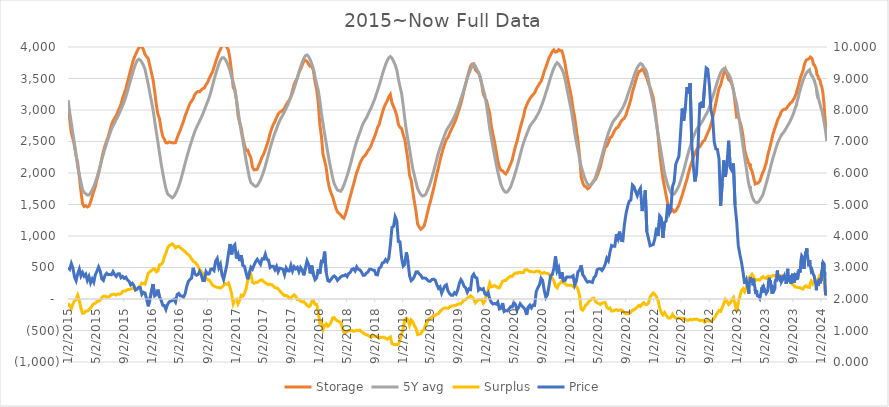
| Category | Storage | 5Y avg | Surplus |
|---|---|---|---|
| 2015-01-02 | 3089 | 3156 | -67 |
| 2015-01-09 | 2854 | 2965 | -111 |
| 2015-01-16 | 2637 | 2791 | -154 |
| 2015-01-23 | 2543 | 2622 | -79 |
| 2015-01-30 | 2428 | 2457 | -29 |
| 2015-02-06 | 2268 | 2279 | -11 |
| 2015-02-13 | 2158 | 2099 | 59 |
| 2015-02-20 | 1938 | 1968 | -30 |
| 2015-02-27 | 1709 | 1853 | -144 |
| 2015-03-06 | 1511 | 1737 | -226 |
| 2015-03-13 | 1468 | 1692 | -224 |
| 2015-03-20 | 1479 | 1672 | -193 |
| 2015-03-27 | 1461 | 1651 | -190 |
| 2015-04-03 | 1476 | 1650 | -174 |
| 2015-04-10 | 1539 | 1684 | -145 |
| 2015-04-17 | 1628 | 1730 | -102 |
| 2015-04-24 | 1711 | 1785 | -74 |
| 2015-05-01 | 1785 | 1853 | -68 |
| 2015-05-08 | 1897 | 1935 | -38 |
| 2015-05-15 | 1989 | 2024 | -35 |
| 2015-05-22 | 2101 | 2118 | -17 |
| 2015-05-29 | 2233 | 2211 | 22 |
| 2015-06-05 | 2344 | 2301 | 43 |
| 2015-06-12 | 2433 | 2387 | 46 |
| 2015-06-19 | 2506 | 2474 | 32 |
| 2015-06-26 | 2579 | 2548 | 31 |
| 2015-07-03 | 2666 | 2623 | 43 |
| 2015-07-10 | 2764 | 2694 | 70 |
| 2015-07-17 | 2823 | 2748 | 75 |
| 2015-07-24 | 2872 | 2796 | 76 |
| 2015-07-31 | 2910 | 2848 | 62 |
| 2015-08-07 | 2975 | 2896 | 79 |
| 2015-08-14 | 3027 | 2950 | 77 |
| 2015-08-21 | 3094 | 3012 | 82 |
| 2015-08-28 | 3190 | 3070 | 120 |
| 2015-09-04 | 3262 | 3133 | 129 |
| 2015-09-11 | 3336 | 3209 | 127 |
| 2015-09-18 | 3441 | 3292 | 149 |
| 2015-09-25 | 3537 | 3385 | 152 |
| 2015-10-02 | 3634 | 3478 | 156 |
| 2015-10-09 | 3731 | 3565 | 166 |
| 2015-10-16 | 3813 | 3651 | 162 |
| 2015-10-23 | 3875 | 3724 | 151 |
| 2015-10-30 | 3931 | 3782 | 149 |
| 2015-11-06 | 3985 | 3805 | 180 |
| 2015-11-13 | 4000 | 3793 | 207 |
| 2015-11-20 | 4009 | 3757 | 252 |
| 2015-11-27 | 3956 | 3709 | 247 |
| 2015-12-04 | 3880 | 3644 | 236 |
| 2015-12-11 | 3846 | 3524 | 322 |
| 2015-12-18 | 3814 | 3403 | 411 |
| 2016-01-08 | 3475 | 3001 | 474 |
| 2016-01-15 | 3297 | 2824 | 473 |
| 2016-01-22 | 3086 | 2654 | 432 |
| 2016-01-29 | 2934 | 2489 | 445 |
| 2016-02-05 | 2864 | 2321 | 543 |
| 2016-02-12 | 2701 | 2151 | 550 |
| 2016-02-19 | 2584 | 2007 | 577 |
| 2016-02-26 | 2536 | 1870 | 666 |
| 2016-03-04 | 2479 | 1752 | 727 |
| 2016-03-11 | 2478 | 1671 | 807 |
| 2016-03-18 | 2493 | 1647 | 846 |
| 2016-04-01 | 2480 | 1606 | 874 |
| 2016-04-08 | 2477 | 1628 | 849 |
| 2016-04-15 | 2484 | 1673 | 811 |
| 2016-04-22 | 2557 | 1725 | 832 |
| 2016-04-29 | 2625 | 1789 | 836 |
| 2016-05-06 | 2681 | 1868 | 813 |
| 2016-05-13 | 2754 | 1959 | 795 |
| 2016-05-20 | 2825 | 2056 | 769 |
| 2016-05-27 | 2907 | 2154 | 753 |
| 2016-06-03 | 2972 | 2250 | 722 |
| 2016-06-10 | 3041 | 2337 | 704 |
| 2016-06-17 | 3103 | 2425 | 678 |
| 2016-06-24 | 3140 | 2503 | 637 |
| 2016-07-01 | 3179 | 2580 | 599 |
| 2016-07-08 | 3243 | 2657 | 586 |
| 2016-07-15 | 3277 | 2718 | 559 |
| 2016-07-22 | 3294 | 2770 | 524 |
| 2016-07-29 | 3288 | 2824 | 464 |
| 2016-08-05 | 3317 | 2877 | 440 |
| 2016-08-12 | 3339 | 2934 | 405 |
| 2016-08-19 | 3350 | 3000 | 350 |
| 2016-08-26 | 3401 | 3067 | 334 |
| 2016-09-02 | 3437 | 3131 | 306 |
| 2016-09-09 | 3499 | 3200 | 299 |
| 2016-09-16 | 3551 | 3283 | 268 |
| 2016-09-23 | 3600 | 3380 | 220 |
| 2016-09-30 | 3680 | 3475 | 205 |
| 2016-10-07 | 3759 | 3567 | 192 |
| 2016-10-14 | 3836 | 3651 | 185 |
| 2016-10-21 | 3909 | 3727 | 182 |
| 2016-10-28 | 3963 | 3790 | 173 |
| 2016-11-04 | 4017 | 3828 | 189 |
| 2016-11-11 | 4047 | 3831 | 216 |
| 2016-11-18 | 4045 | 3804 | 241 |
| 2016-11-25 | 3995 | 3760 | 235 |
| 2016-12-02 | 3953 | 3699 | 254 |
| 2016-12-09 | 3806 | 3620 | 186 |
| 2016-12-16 | 3597 | 3519 | 78 |
| 2016-12-23 | 3360 | 3439 | -79 |
| 2016-12-30 | 3311 | 3332 | -21 |
| 2017-01-06 | 3160 | 3164 | -4 |
| 2017-01-13 | 2917 | 2994 | -77 |
| 2017-01-20 | 2798 | 2818 | -20 |
| 2017-01-27 | 2711 | 2652 | 59 |
| 2017-02-03 | 2559 | 2514 | 45 |
| 2017-02-10 | 2445 | 2358 | 87 |
| 2017-02-17 | 2356 | 2200 | 156 |
| 2017-02-24 | 2363 | 2068 | 295 |
| 2017-03-03 | 2295 | 1932 | 363 |
| 2017-03-10 | 2242 | 1847 | 395 |
| 2017-03-17 | 2092 | 1826 | 266 |
| 2017-03-24 | 2049 | 1799 | 250 |
| 2017-03-31 | 2051 | 1786 | 265 |
| 2017-04-07 | 2061 | 1798 | 263 |
| 2017-04-21 | 2189 | 1890 | 299 |
| 2017-04-28 | 2256 | 1953 | 303 |
| 2017-05-05 | 2301 | 2026 | 275 |
| 2017-05-12 | 2369 | 2113 | 256 |
| 2017-05-19 | 2444 | 2203 | 241 |
| 2017-05-26 | 2525 | 2300 | 225 |
| 2017-06-02 | 2631 | 2394 | 237 |
| 2017-06-09 | 2709 | 2481 | 228 |
| 2017-06-16 | 2770 | 2563 | 207 |
| 2017-06-23 | 2816 | 2635 | 181 |
| 2017-06-30 | 2878 | 2701 | 177 |
| 2017-07-07 | 2936 | 2773 | 163 |
| 2017-07-14 | 2963 | 2832 | 131 |
| 2017-07-21 | 2980 | 2879 | 101 |
| 2017-07-28 | 2999 | 2923 | 76 |
| 2017-08-04 | 3029 | 2977 | 52 |
| 2017-08-11 | 3082 | 3027 | 55 |
| 2017-08-18 | 3125 | 3080 | 45 |
| 2017-08-25 | 3155 | 3147 | 8 |
| 2017-09-01 | 3220 | 3205 | 15 |
| 2017-09-08 | 3311 | 3268 | 43 |
| 2017-09-15 | 3408 | 3341 | 67 |
| 2017-09-22 | 3466 | 3425 | 41 |
| 2017-09-29 | 3508 | 3516 | -8 |
| 2017-10-06 | 3595 | 3603 | -8 |
| 2017-10-13 | 3645 | 3681 | -36 |
| 2017-10-20 | 3710 | 3756 | -46 |
| 2017-10-27 | 3775 | 3816 | -41 |
| 2017-11-03 | 3790 | 3861 | -71 |
| 2017-11-10 | 3772 | 3873 | -101 |
| 2017-11-17 | 3726 | 3847 | -121 |
| 2017-11-24 | 3693 | 3800 | -107 |
| 2017-12-01 | 3695 | 3731 | -36 |
| 2017-12-08 | 3626 | 3653 | -27 |
| 2017-12-15 | 3444 | 3528 | -84 |
| 2017-12-22 | 3332 | 3417 | -85 |
| 2017-12-29 | 3126 | 3318 | -192 |
| 2018-01-05 | 2767 | 3149 | -382 |
| 2018-01-12 | 2584 | 2946 | -362 |
| 2018-01-19 | 2296 | 2782 | -486 |
| 2018-01-26 | 2197 | 2622 | -425 |
| 2018-02-02 | 2078 | 2471 | -393 |
| 2018-02-09 | 1884 | 2317 | -433 |
| 2018-02-16 | 1760 | 2172 | -412 |
| 2018-02-23 | 1682 | 2054 | -372 |
| 2018-03-02 | 1625 | 1925 | -300 |
| 2018-03-09 | 1532 | 1828 | -296 |
| 2018-03-16 | 1446 | 1775 | -329 |
| 2018-03-23 | 1383 | 1729 | -346 |
| 2018-04-06 | 1335 | 1710 | -375 |
| 2018-04-13 | 1299 | 1748 | -449 |
| 2018-04-20 | 1281 | 1808 | -527 |
| 2018-04-27 | 1343 | 1877 | -534 |
| 2018-05-04 | 1432 | 1952 | -520 |
| 2018-05-11 | 1538 | 2039 | -501 |
| 2018-05-18 | 1629 | 2128 | -499 |
| 2018-05-25 | 1725 | 2225 | -500 |
| 2018-06-01 | 1817 | 2329 | -512 |
| 2018-06-08 | 1913 | 2420 | -507 |
| 2018-06-15 | 2008 | 2503 | -495 |
| 2018-06-22 | 2074 | 2575 | -501 |
| 2018-06-29 | 2152 | 2645 | -493 |
| 2018-07-06 | 2203 | 2722 | -519 |
| 2018-07-13 | 2248 | 2784 | -536 |
| 2018-07-20 | 2272 | 2830 | -558 |
| 2018-07-27 | 2305 | 2873 | -568 |
| 2018-08-03 | 2353 | 2926 | -573 |
| 2018-08-10 | 2386 | 2982 | -596 |
| 2018-08-17 | 2435 | 3034 | -599 |
| 2018-08-24 | 2504 | 3093 | -589 |
| 2018-08-31 | 2567 | 3158 | -591 |
| 2018-09-07 | 2636 | 3232 | -596 |
| 2018-09-14 | 2722 | 3308 | -586 |
| 2018-09-21 | 2768 | 3389 | -621 |
| 2018-09-28 | 2866 | 3473 | -607 |
| 2018-10-05 | 2956 | 3563 | -607 |
| 2018-10-12 | 3037 | 3642 | -605 |
| 2018-10-19 | 3095 | 3719 | -624 |
| 2018-10-26 | 3143 | 3781 | -638 |
| 2018-11-02 | 3208 | 3829 | -621 |
| 2018-11-09 | 3247 | 3848 | -601 |
| 2018-11-16 | 3113 | 3823 | -710 |
| 2018-11-23 | 3054 | 3774 | -720 |
| 2018-11-30 | 2991 | 3716 | -725 |
| 2018-12-07 | 2914 | 3637 | -723 |
| 2018-12-14 | 2773 | 3493 | -720 |
| 2018-12-21 | 2725 | 3372 | -647 |
| 2018-12-28 | 2705 | 3265 | -560 |
| 2019-01-04 | 2614 | 3078 | -464 |
| 2019-01-11 | 2533 | 2860 | -327 |
| 2019-01-18 | 2370 | 2675 | -305 |
| 2019-01-25 | 2197 | 2525 | -328 |
| 2019-02-01 | 1960 | 2375 | -415 |
| 2019-02-08 | 1882 | 2215 | -333 |
| 2019-02-15 | 1705 | 2067 | -362 |
| 2019-02-22 | 1539 | 1963 | -424 |
| 2019-03-01 | 1390 | 1854 | -464 |
| 2019-03-08 | 1190 | 1755 | -565 |
| 2019-03-15 | 1143 | 1699 | -556 |
| 2019-03-22 | 1107 | 1658 | -551 |
| 2019-03-29 | 1130 | 1635 | -505 |
| 2019-04-05 | 1155 | 1640 | -485 |
| 2019-04-12 | 1247 | 1661 | -414 |
| 2019-04-26 | 1462 | 1778 | -316 |
| 2019-05-03 | 1547 | 1850 | -303 |
| 2019-05-10 | 1653 | 1939 | -286 |
| 2019-05-17 | 1753 | 2027 | -274 |
| 2019-05-24 | 1867 | 2124 | -257 |
| 2019-05-31 | 1986 | 2226 | -240 |
| 2019-06-07 | 2088 | 2318 | -230 |
| 2019-06-14 | 2203 | 2402 | -199 |
| 2019-06-21 | 2301 | 2472 | -171 |
| 2019-06-28 | 2390 | 2542 | -152 |
| 2019-07-05 | 2471 | 2613 | -142 |
| 2019-07-12 | 2533 | 2676 | -143 |
| 2019-07-19 | 2569 | 2720 | -151 |
| 2019-07-26 | 2634 | 2757 | -123 |
| 2019-08-02 | 2689 | 2800 | -111 |
| 2019-08-09 | 2738 | 2849 | -111 |
| 2019-08-16 | 2797 | 2900 | -103 |
| 2019-08-23 | 2857 | 2957 | -100 |
| 2019-08-30 | 2941 | 3023 | -82 |
| 2019-09-06 | 3019 | 3096 | -77 |
| 2019-09-13 | 3103 | 3178 | -75 |
| 2019-09-20 | 3205 | 3252 | -47 |
| 2019-09-27 | 3317 | 3335 | -18 |
| 2019-10-04 | 3415 | 3424 | -9 |
| 2019-10-11 | 3519 | 3505 | 14 |
| 2019-10-18 | 3606 | 3578 | 28 |
| 2019-10-25 | 3695 | 3643 | 52 |
| 2019-11-01 | 3729 | 3700 | 29 |
| 2019-11-08 | 3732 | 3730 | 2 |
| 2019-11-15 | 3638 | 3698 | -60 |
| 2019-11-22 | 3610 | 3641 | -31 |
| 2019-11-29 | 3591 | 3600 | -9 |
| 2019-12-06 | 3518 | 3532 | -14 |
| 2019-12-13 | 3411 | 3420 | -9 |
| 2019-12-20 | 3250 | 3319 | -69 |
| 2019-12-27 | 3192 | 3230 | -38 |
| 2020-01-03 | 3148 | 3074 | 74 |
| 2020-01-10 | 3039 | 2890 | 149 |
| 2020-01-17 | 2947 | 2696 | 251 |
| 2020-01-24 | 2746 | 2553 | 193 |
| 2020-01-31 | 2609 | 2410 | 199 |
| 2020-02-07 | 2494 | 2279 | 215 |
| 2020-02-14 | 2343 | 2143 | 200 |
| 2020-02-21 | 2200 | 2021 | 179 |
| 2020-02-28 | 2091 | 1915 | 176 |
| 2020-03-06 | 2043 | 1816 | 227 |
| 2020-03-13 | 2034 | 1753 | 281 |
| 2020-03-20 | 2005 | 1713 | 292 |
| 2020-03-27 | 1986 | 1694 | 292 |
| 2020-04-03 | 2024 | 1700 | 324 |
| 2020-04-17 | 2140 | 1776 | 364 |
| 2020-04-24 | 2210 | 1850 | 360 |
| 2020-05-01 | 2319 | 1924 | 395 |
| 2020-05-08 | 2422 | 2009 | 413 |
| 2020-05-15 | 2503 | 2096 | 407 |
| 2020-05-22 | 2612 | 2189 | 423 |
| 2020-05-29 | 2714 | 2292 | 422 |
| 2020-06-05 | 2807 | 2386 | 421 |
| 2020-06-12 | 2892 | 2473 | 419 |
| 2020-06-19 | 3012 | 2546 | 466 |
| 2020-06-26 | 3077 | 2611 | 466 |
| 2020-07-03 | 3133 | 2679 | 454 |
| 2020-07-10 | 3178 | 2742 | 436 |
| 2020-07-17 | 3215 | 2779 | 436 |
| 2020-07-24 | 3241 | 2812 | 429 |
| 2020-07-31 | 3274 | 2845 | 429 |
| 2020-08-07 | 3332 | 2889 | 443 |
| 2020-08-14 | 3375 | 2933 | 442 |
| 2020-08-21 | 3420 | 2982 | 438 |
| 2020-08-28 | 3455 | 3048 | 407 |
| 2020-09-04 | 3525 | 3116 | 409 |
| 2020-09-11 | 3614 | 3193 | 421 |
| 2020-09-18 | 3680 | 3273 | 407 |
| 2020-09-25 | 3756 | 3351 | 405 |
| 2020-10-02 | 3831 | 3437 | 394 |
| 2020-10-09 | 3877 | 3524 | 353 |
| 2020-10-16 | 3926 | 3599 | 327 |
| 2020-10-23 | 3955 | 3666 | 289 |
| 2020-10-30 | 3919 | 3718 | 201 |
| 2020-11-06 | 3927 | 3751 | 176 |
| 2020-11-13 | 3958 | 3727 | 231 |
| 2020-11-20 | 3940 | 3690 | 250 |
| 2020-11-27 | 3939 | 3649 | 290 |
| 2020-12-04 | 3848 | 3588 | 260 |
| 2020-12-11 | 3726 | 3483 | 243 |
| 2020-12-18 | 3574 | 3356 | 218 |
| 2021-01-08 | 3196 | 2978 | 218 |
| 2021-01-15 | 3009 | 2811 | 198 |
| 2021-01-22 | 2881 | 2637 | 244 |
| 2021-01-29 | 2689 | 2491 | 198 |
| 2021-02-05 | 2518 | 2366 | 152 |
| 2021-02-12 | 2281 | 2224 | 57 |
| 2021-02-19 | 1943 | 2104 | -161 |
| 2021-02-26 | 1845 | 2023 | -178 |
| 2021-03-05 | 1793 | 1934 | -141 |
| 2021-03-12 | 1782 | 1875 | -93 |
| 2021-03-19 | 1750 | 1824 | -74 |
| 2021-03-26 | 1764 | 1800 | -36 |
| 2021-04-09 | 1845 | 1834 | 11 |
| 2021-04-16 | 1883 | 1871 | 12 |
| 2021-04-23 | 1898 | 1938 | -40 |
| 2021-04-30 | 1958 | 2019 | -61 |
| 2021-05-07 | 2029 | 2101 | -72 |
| 2021-05-14 | 2100 | 2187 | -87 |
| 2021-05-21 | 2215 | 2278 | -63 |
| 2021-05-28 | 2313 | 2374 | -61 |
| 2021-06-04 | 2411 | 2466 | -55 |
| 2021-06-11 | 2427 | 2553 | -126 |
| 2021-06-18 | 2482 | 2636 | -154 |
| 2021-06-25 | 2558 | 2701 | -143 |
| 2021-07-02 | 2574 | 2764 | -190 |
| 2021-07-09 | 2629 | 2818 | -189 |
| 2021-07-16 | 2678 | 2854 | -176 |
| 2021-07-23 | 2714 | 2882 | -168 |
| 2021-07-30 | 2727 | 2912 | -185 |
| 2021-08-06 | 2776 | 2954 | -178 |
| 2021-08-13 | 2822 | 2996 | -174 |
| 2021-08-20 | 2851 | 3040 | -189 |
| 2021-08-27 | 2871 | 3093 | -222 |
| 2021-09-03 | 2923 | 3158 | -235 |
| 2021-09-10 | 3006 | 3237 | -231 |
| 2021-09-17 | 3082 | 3311 | -229 |
| 2021-09-24 | 3170 | 3383 | -213 |
| 2021-10-01 | 3288 | 3464 | -176 |
| 2021-10-08 | 3369 | 3543 | -174 |
| 2021-10-15 | 3461 | 3612 | -151 |
| 2021-10-22 | 3548 | 3674 | -126 |
| 2021-10-29 | 3611 | 3712 | -101 |
| 2021-11-05 | 3618 | 3737 | -119 |
| 2021-11-12 | 3644 | 3725 | -81 |
| 2021-11-19 | 3623 | 3681 | -58 |
| 2021-11-26 | 3564 | 3650 | -86 |
| 2021-12-03 | 3505 | 3595 | -90 |
| 2021-12-10 | 3417 | 3481 | -64 |
| 2021-12-17 | 3362 | 3328 | 34 |
| 2021-12-31 | 3195 | 3099 | 96 |
| 2022-01-07 | 3016 | 2944 | 72 |
| 2022-01-14 | 2810 | 2777 | 33 |
| 2022-01-21 | 2591 | 2616 | -25 |
| 2022-01-28 | 2323 | 2466 | -143 |
| 2022-02-04 | 2101 | 2316 | -215 |
| 2022-02-11 | 1911 | 2162 | -251 |
| 2022-02-18 | 1782 | 1996 | -214 |
| 2022-02-25 | 1643 | 1898 | -255 |
| 2022-03-04 | 1519 | 1809 | -290 |
| 2022-03-11 | 1440 | 1744 | -304 |
| 2022-03-18 | 1389 | 1682 | -293 |
| 2022-03-25 | 1415 | 1659 | -244 |
| 2022-04-01 | 1382 | 1667 | -285 |
| 2022-04-08 | 1397 | 1700 | -303 |
| 2022-04-22 | 1490 | 1795 | -305 |
| 2022-04-29 | 1567 | 1873 | -306 |
| 2022-05-06 | 1643 | 1955 | -312 |
| 2022-05-13 | 1732 | 2042 | -310 |
| 2022-05-20 | 1819 | 2139 | -320 |
| 2022-05-27 | 1901 | 2239 | -338 |
| 2022-06-03 | 2003 | 2339 | -336 |
| 2022-06-10 | 2095 | 2418 | -323 |
| 2022-06-17 | 2169 | 2500 | -331 |
| 2022-06-24 | 2251 | 2573 | -322 |
| 2022-07-01 | 2311 | 2633 | -322 |
| 2022-07-08 | 2369 | 2688 | -319 |
| 2022-07-15 | 2401 | 2729 | -328 |
| 2022-07-22 | 2416 | 2761 | -345 |
| 2022-07-29 | 2457 | 2794 | -337 |
| 2022-08-05 | 2501 | 2839 | -338 |
| 2022-08-12 | 2519 | 2886 | -367 |
| 2022-08-19 | 2579 | 2932 | -353 |
| 2022-08-26 | 2640 | 2978 | -338 |
| 2022-09-02 | 2694 | 3043 | -349 |
| 2022-09-09 | 2771 | 3125 | -354 |
| 2022-09-16 | 2874 | 3206 | -332 |
| 2022-09-23 | 2977 | 3283 | -306 |
| 2022-09-30 | 3106 | 3370 | -264 |
| 2022-10-07 | 3231 | 3452 | -221 |
| 2022-10-14 | 3342 | 3525 | -183 |
| 2022-10-21 | 3394 | 3591 | -197 |
| 2022-10-28 | 3501 | 3636 | -135 |
| 2022-11-04 | 3580 | 3656 | -76 |
| 2022-11-11 | 3644 | 3651 | -7 |
| 2022-11-18 | 3564 | 3603 | -39 |
| 2022-11-25 | 3483 | 3569 | -86 |
| 2022-12-02 | 3462 | 3520 | -58 |
| 2022-12-09 | 3412 | 3427 | -15 |
| 2022-12-16 | 3325 | 3303 | 22 |
| 2022-12-23 | 3112 | 3197 | -85 |
| 2022-12-30 | 2891 | 3099 | -208 |
| 2023-01-06 | 2902 | 2942 | -40 |
| 2023-01-13 | 2820 | 2786 | 34 |
| 2023-01-20 | 2734 | 2601 | 133 |
| 2023-01-27 | 2583 | 2420 | 163 |
| 2023-02-03 | 2366 | 2249 | 117 |
| 2023-02-10 | 2266 | 2083 | 183 |
| 2023-02-17 | 2195 | 1906 | 289 |
| 2023-02-19 | 2163 | 1862 | 301 |
| 2023-02-20 | 2163 | 1846 | 317 |
| 2023-02-21 | 2156 | 1827 | 329 |
| 2023-02-22 | 2150 | 1805 | 345 |
| 2023-02-23 | 2147 | 1795 | 352 |
| 2023-02-24 | 2144 | 1790 | 354 |
| 2023-02-25 | 2125 | 1775 | 350 |
| 2023-02-26 | 2116 | 1765 | 351 |
| 2023-02-27 | 2145 | 1791 | 354 |
| 2023-02-28 | 2090 | 1727.6 | 362.4 |
| 2023-03-01 | 2089.3 | 1724 | 365.3 |
| 2023-03-07 | 2028 | 1635 | 393 |
| 2023-03-08 | 2018.7 | 1626 | 392.7 |
| 2023-03-09 | 2007 | 1615 | 392 |
| 2023-03-10 | 1982 | 1607 | 375 |
| 2023-03-11 | 1969.9 | 1595.7 | 374.2 |
| 2023-03-12 | 1959.1 | 1584.6 | 374.5 |
| 2023-03-13 | 1944 | 1580 | 364 |
| 2023-03-14 | 1928 | 1573 | 355 |
| 2023-03-15 | 1908 | 1563.9 | 344.1 |
| 2023-03-16 | 1897.4 | 1559.5 | 337.9 |
| 2023-03-17 | 1894.6 | 1556.7 | 337.9 |
| 2023-03-20 | 1846.5 | 1541.4 | 305.1 |
| 2023-03-21 | 1827 | 1538.9 | 288.1 |
| 2023-03-22 | 1818.9 | 1536.1 | 282.8 |
| 2023-03-23 | 1816.8 | 1534 | 282.8 |
| 2023-03-24 | 1834.9 | 1534.9 | 300 |
| 2023-03-27 | 1835.5 | 1530 | 305.5 |
| 2023-03-28 | 1834.7 | 1529.6 | 305.1 |
| 2023-03-29 | 1831.2 | 1530 | 301.2 |
| 2023-03-30 | 1824.4 | 1529.9 | 294.5 |
| 2023-03-31 | 1833 | 1532 | 301 |
| 2023-04-03 | 1842 | 1536 | 306 |
| 2023-04-04 | 1842 | 1540 | 302 |
| 2023-04-05 | 1848 | 1544 | 304 |
| 2023-04-10 | 1869 | 1569 | 300 |
| 2023-04-14 | 1910.2 | 1594.1 | 316.1 |
| 2023-04-18 | 1959 | 1618 | 341 |
| 2023-04-19 | 1965.2 | 1624.2 | 341 |
| 2023-04-20 | 1972.7 | 1630.3 | 342.4 |
| 2023-04-21 | 1987.9 | 1636.7 | 351.2 |
| 2023-04-24 | 2015.3 | 1660.2 | 355.1 |
| 2023-04-25 | 2018.8 | 1671.7 | 347.1 |
| 2023-04-26 | 2023 | 1682 | 341 |
| 2023-04-27 | 2032.6 | 1693.5 | 339.1 |
| 2023-04-28 | 2045 | 1709 | 336 |
| 2023-05-08 | 2158.5 | 1831.9 | 326.6 |
| 2023-05-11 | 2205.3 | 1871.7 | 333.6 |
| 2023-05-12 | 2232.2 | 1884.4 | 347.8 |
| 2023-05-15 | 2283.7 | 1924.2 | 359.5 |
| 2023-05-16 | 2299.9 | 1938.2 | 361.7 |
| 2023-05-17 | 2316.2 | 1951.8 | 364.4 |
| 2023-05-18 | 2330.5 | 1965.5 | 365 |
| 2023-05-19 | 2328.9 | 1979.6 | 349.3 |
| 2023-05-22 | 2375.7 | 2021.2 | 354.5 |
| 2023-05-23 | 2393.6 | 2036.1 | 357.5 |
| 2023-05-24 | 2409.1 | 2050.2 | 358.9 |
| 2023-05-25 | 2423.3 | 2064.9 | 358.4 |
| 2023-05-30 | 2493.9 | 2139.1 | 354.8 |
| 2023-06-01 | 2524.7 | 2166.4 | 358.3 |
| 2023-06-02 | 2543.8 | 2179.9 | 363.9 |
| 2023-06-07 | 2620.7 | 2244.5 | 376.2 |
| 2023-06-08 | 2635.6 | 2256.4 | 379.2 |
| 2023-06-09 | 2635.4 | 2267 | 368.4 |
| 2023-06-12 | 2676.5 | 2304.1 | 372.4 |
| 2023-06-13 | 2688 | 2315.5 | 372.5 |
| 2023-06-15 | 2709.8 | 2339.8 | 370 |
| 2023-06-16 | 2716.3 | 2353.4 | 362.9 |
| 2023-06-19 | 2751.3 | 2388.2 | 363.1 |
| 2023-06-20 | 2762.5 | 2400.9 | 361.6 |
| 2023-06-22 | 2780.6 | 2422.4 | 358.2 |
| 2023-06-23 | 2797 | 2434 | 363 |
| 2023-06-26 | 2830.7 | 2465.3 | 365.4 |
| 2023-06-27 | 2839.9 | 2474.6 | 365.3 |
| 2023-06-29 | 2858.3 | 2492.2 | 366.1 |
| 2023-07-03 | 2884.3 | 2525.8 | 358.5 |
| 2023-07-04 | 2892.3 | 2533.8 | 358.5 |
| 2023-07-05 | 2897.8 | 2541.6 | 356.2 |
| 2023-07-06 | 2906 | 2549.8 | 356.2 |
| 2023-07-07 | 2912.5 | 2557.6 | 354.9 |
| 2023-07-10 | 2949 | 2579.5 | 369.5 |
| 2023-07-11 | 2957.8 | 2585.3 | 372.5 |
| 2023-07-12 | 2965.1 | 2591.9 | 373.2 |
| 2023-07-13 | 2971.1 | 2598.2 | 372.9 |
| 2023-07-14 | 2979.5 | 2603.3 | 376.2 |
| 2023-07-17 | 2991.6 | 2620.4 | 371.2 |
| 2023-07-18 | 2996.7 | 2625 | 371.7 |
| 2023-07-19 | 3000.9 | 2629.4 | 371.5 |
| 2023-07-20 | 3006.6 | 2634 | 372.6 |
| 2023-07-21 | 2992.5 | 2637 | 355.5 |
| 2023-07-24 | 3010.9 | 2651.1 | 359.8 |
| 2023-07-25 | 3012.7 | 2656.4 | 356.3 |
| 2023-07-26 | 3015.9 | 2661.8 | 354.1 |
| 2023-07-27 | 3016.4 | 2667.7 | 348.7 |
| 2023-07-28 | 3007 | 2672.8 | 334.2 |
| 2023-07-31 | 3011.8 | 2689.9 | 321.9 |
| 2023-08-01 | 3015.6 | 2696.4 | 319.2 |
| 2023-08-02 | 3020.6 | 2703 | 317.6 |
| 2023-08-03 | 3024.5 | 2709.5 | 315 |
| 2023-08-04 | 3023 | 2717.2 | 305.8 |
| 2023-08-07 | 3035.6 | 2736 | 299.6 |
| 2023-08-08 | 3041.7 | 2744.7 | 297 |
| 2023-08-09 | 3044.7 | 2748.1 | 296.6 |
| 2023-08-10 | 3050.9 | 2755.6 | 295.3 |
| 2023-08-11 | 3061 | 2762 | 299 |
| 2023-08-14 | 3073.1 | 2777.7 | 295.4 |
| 2023-08-15 | 3077.6 | 2784.8 | 292.8 |
| 2023-08-16 | 3082.4 | 2792.1 | 290.3 |
| 2023-08-17 | 3087.8 | 2798.5 | 289.3 |
| 2023-08-18 | 3091 | 2806.3 | 284.7 |
| 2023-08-21 | 3109.7 | 2827.4 | 282.3 |
| 2023-08-22 | 3110.5 | 2834.9 | 275.6 |
| 2023-08-23 | 3114.1 | 2842.3 | 271.8 |
| 2023-08-24 | 3115.5 | 2849.5 | 266 |
| 2023-08-28 | 3125.6 | 2883.6 | 242 |
| 2023-08-29 | 3129.7 | 2889.1 | 240.6 |
| 2023-08-30 | 3137 | 2897.6 | 239.4 |
| 2023-08-31 | 3143.1 | 2906.3 | 236.8 |
| 2023-09-01 | 3151.1 | 2915.7 | 235.4 |
| 2023-09-04 | 3169.5 | 2943.6 | 225.9 |
| 2023-09-05 | 3172.7 | 2954.5 | 218.2 |
| 2023-09-06 | 3179.1 | 2965.4 | 213.7 |
| 2023-09-07 | 3184.6 | 2976.3 | 208.3 |
| 2023-09-08 | 3186.4 | 2988.8 | 197.6 |
| 2023-09-11 | 3213 | 3022.5 | 190.5 |
| 2023-09-12 | 3222.2 | 3034.7 | 187.5 |
| 2023-09-13 | 3234.8 | 3046.7 | 188.1 |
| 2023-09-14 | 3245.5 | 3059.3 | 186.2 |
| 2023-09-17 | 3260.1 | 3071.9 | 188.2 |
| 2023-09-18 | 3295.1 | 3108.2 | 186.9 |
| 2023-09-19 | 3307.1 | 3120 | 187.1 |
| 2023-09-20 | 3318.7 | 3131.9 | 186.8 |
| 2023-09-21 | 3330.4 | 3144 | 186.4 |
| 2023-09-22 | 3344 | 3159 | 185 |
| 2023-09-25 | 3378 | 3194.6 | 183.4 |
| 2023-09-26 | 3389.6 | 3209.1 | 180.5 |
| 2023-09-27 | 3402.1 | 3223.7 | 178.4 |
| 2023-09-28 | 3418.3 | 3244 | 174.3 |
| 2023-09-29 | 3439.3 | 3262 | 177.3 |
| 2023-09-30 | 3445.7 | 3269.7 | 176 |
| 2023-10-03 | 3488.4 | 3311.6 | 176.8 |
| 2023-10-04 | 3501.7 | 3325.1 | 176.6 |
| 2023-10-05 | 3520.1 | 3340.8 | 179.3 |
| 2023-10-06 | 3519.4 | 3350 | 169.4 |
| 2023-10-10 | 3565.4 | 3401.3 | 164.1 |
| 2023-10-11 | 3575.8 | 3413.3 | 162.5 |
| 2023-10-12 | 3587.5 | 3425.6 | 161.9 |
| 2023-10-13 | 3593.7 | 3436.5 | 157.2 |
| 2023-10-16 | 3629 | 3471.1 | 157.9 |
| 2023-10-17 | 3636.3 | 3479.9 | 156.4 |
| 2023-10-18 | 3649 | 3490.3 | 158.7 |
| 2023-10-19 | 3656.6 | 3498.9 | 157.7 |
| 2023-10-20 | 3693.5 | 3505.9 | 187.6 |
| 2023-10-23 | 3732.5 | 3532.8 | 199.7 |
| 2023-10-25 | 3754.4 | 3549.2 | 205.2 |
| 2023-10-26 | 3765.4 | 3557.4 | 208 |
| 2023-10-27 | 3770.7 | 3564.8 | 205.9 |
| 2023-10-30 | 3793.3 | 3585.7 | 207.6 |
| 2023-10-31 | 3792.6 | 3590.9 | 201.7 |
| 2023-11-01 | 3787.7 | 3596.2 | 191.5 |
| 2023-11-02 | 3778.6 | 3601.4 | 177.2 |
| 2023-11-03 | 3778.6 | 3601.4 | 177.2 |
| 2023-11-08 | 3810.3 | 3622.8 | 187.5 |
| 2023-11-09 | 3817.3 | 3625.4 | 191.9 |
| 2023-11-10 | 3824 | 3628.2 | 195.8 |
| 2023-11-13 | 3820.1 | 3636.8 | 183.3 |
| 2023-11-14 | 3822.5 | 3616.9 | 205.6 |
| 2023-11-15 | 3822.1 | 3609.5 | 212.6 |
| 2023-11-17 | 3841 | 3586.7 | 254.3 |
| 2023-11-21 | 3845.5 | 3559 | 286.5 |
| 2023-11-23 | 3824.6 | 3546.9 | 277.7 |
| 2023-11-24 | 3818.6 | 3540.8 | 277.8 |
| 2023-11-27 | 3783.9 | 3521 | 262.9 |
| 2023-11-29 | 3744.4 | 3507.5 | 236.9 |
| 2023-11-30 | 3724.4 | 3500.6 | 223.8 |
| 2023-12-01 | 3732.9 | 3493.1 | 239.8 |
| 2023-12-04 | 3719.4 | 3468.1 | 251.3 |
| 2023-12-05 | 3712.1 | 3456.6 | 255.5 |
| 2023-12-06 | 3704.3 | 3444.9 | 259.4 |
| 2023-12-07 | 3693.3 | 3433.6 | 259.7 |
| 2023-12-11 | 3659.6 | 3379.6 | 280 |
| 2023-12-13 | 3630.3 | 3349.1 | 281.2 |
| 2023-12-14 | 3614 | 3334.2 | 279.8 |
| 2023-12-15 | 3571.3 | 3268.3 | 303 |
| 2023-12-16 | 3559.8 | 3250.5 | 309.3 |
| 2023-12-18 | 3571.3 | 3268.3 | 303 |
| 2023-12-19 | 3559.8 | 3250.5 | 309.3 |
| 2023-12-20 | 3540.9 | 3232.7 | 308.2 |
| 2023-12-21 | 3520 | 3210 | 310 |
| 2023-12-22 | 3508.8 | 3196.2 | 312.6 |
| 2023-12-23 | 3498.3 | 3177.1 | 321.2 |
| 2023-12-24 | 3494.8 | 3159.5 | 335.3 |
| 2023-12-26 | 3489 | 3131.2 | 357.8 |
| 2023-12-27 | 3485.2 | 3117.2 | 368 |
| 2023-12-28 | 3479.6 | 3104.5 | 375.1 |
| 2023-12-29 | 3466 | 3093.5 | 372.5 |
| 2023-12-30 | 3453.8 | 3079.1 | 374.7 |
| 2024-01-01 | 3416.8 | 3049.9 | 366.9 |
| 2024-01-02 | 3410.4 | 3040.4 | 370 |
| 2024-01-03 | 3389.5 | 3027.5 | 362 |
| 2024-01-04 | 3377.7 | 3015.6 | 362.1 |
| 2024-01-05 | 3385.6 | 3003.9 | 381.7 |
| 2024-01-06 | 3366.6 | 2991 | 375.6 |
| 2024-01-08 | 3326.7 | 2960.5 | 366.2 |
| 2024-01-09 | 3305.2 | 2942.6 | 362.6 |
| 2024-01-10 | 3286 | 2924.6 | 361.4 |
| 2024-01-11 | 3261 | 2906.8 | 354.2 |
| 2024-01-12 | 3213.3 | 2884.4 | 328.9 |
| 2024-01-15 | 3113.4 | 2827.1 | 286.3 |
| 2024-01-16 | 3064.1 | 2806.3 | 257.8 |
| 2024-01-17 | 3008.1 | 2785.4 | 222.7 |
| 2024-01-18 | 2953 | 2764.1 | 188.9 |
| 2024-01-19 | 2919.2 | 2743 | 176.2 |
| 2024-01-22 | 2767 | 2671.8 | 95.2 |
| 2024-01-23 | 2725.7 | 2645.3 | 80.4 |
| 2024-01-24 | 2700.9 | 2618.9 | 82 |
| 2024-01-25 | 2684.7 | 2592.3 | 92.4 |
| 2024-01-26 | 2666.7 | 2562 | 104.7 |
| 2024-01-27 | 2657.6 | 2535.9 | 121.7 |
| 2024-01-28 | 2646.3 | 2509.1 | 137.2 |